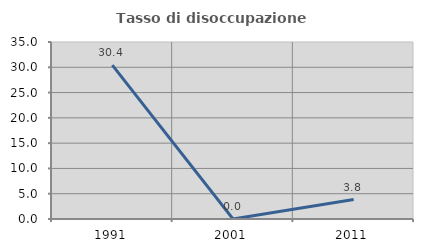
| Category | Tasso di disoccupazione giovanile  |
|---|---|
| 1991.0 | 30.435 |
| 2001.0 | 0 |
| 2011.0 | 3.846 |